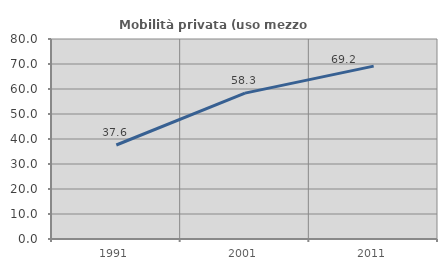
| Category | Mobilità privata (uso mezzo privato) |
|---|---|
| 1991.0 | 37.594 |
| 2001.0 | 58.343 |
| 2011.0 | 69.162 |